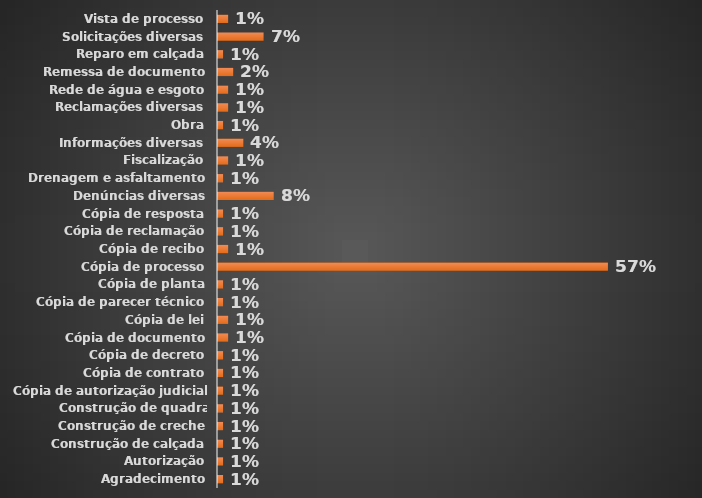
| Category | Total |
|---|---|
| Agradecimento | 0.007 |
| Autorização | 0.007 |
| Construção de calçada | 0.007 |
| Construção de creche | 0.007 |
| Construção de quadra esportiva | 0.007 |
| Cópia de autorização judicial | 0.007 |
| Cópia de contrato | 0.007 |
| Cópia de decreto | 0.007 |
| Cópia de documento | 0.015 |
| Cópia de lei | 0.015 |
| Cópia de parecer técnico | 0.007 |
| Cópia de planta | 0.007 |
| Cópia de processo | 0.575 |
| Cópia de recibo | 0.015 |
| Cópia de reclamação | 0.007 |
| Cópia de resposta | 0.007 |
| Denúncias diversas | 0.082 |
| Drenagem e asfaltamento | 0.007 |
| Fiscalização | 0.015 |
| Informações diversas | 0.037 |
| Obra | 0.007 |
| Reclamações diversas | 0.015 |
| Rede de água e esgoto | 0.015 |
| Remessa de documento | 0.022 |
| Reparo em calçada | 0.007 |
| Solicitações diversas | 0.067 |
| Vista de processo | 0.015 |